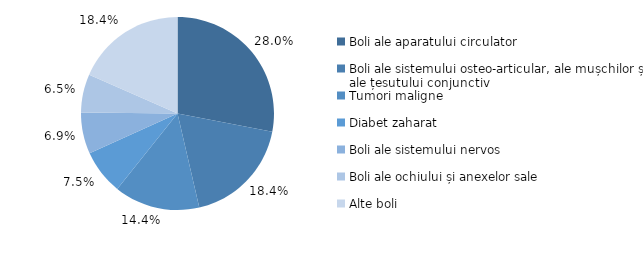
| Category | 2021 |
|---|---|
| Boli ale aparatului circulator | 28.028 |
| Boli ale sistemului osteo-articular, ale mușchilor și ale țesutului conjunctiv | 18.345 |
| Tumori maligne | 14.359 |
| Diabet zaharat | 7.494 |
| Boli ale sistemului nervos | 6.924 |
| Boli ale ochiului și anexelor sale | 6.445 |
| Alte boli | 18.405 |